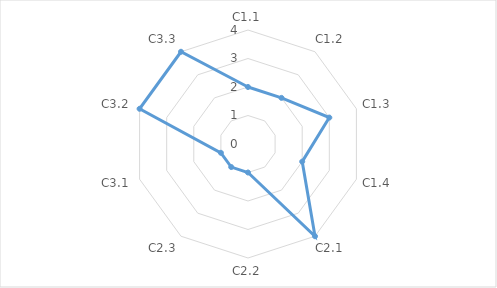
| Category | Series 0 |
|---|---|
| C1.1 | 2 |
| C1.2 | 2 |
| C1.3 | 3 |
| C1.4 | 2 |
| C2.1 | 4 |
| C2.2 | 1 |
| C2.3 | 1 |
| C3.1 | 1 |
| C3.2 | 4 |
| C3.3 | 4 |